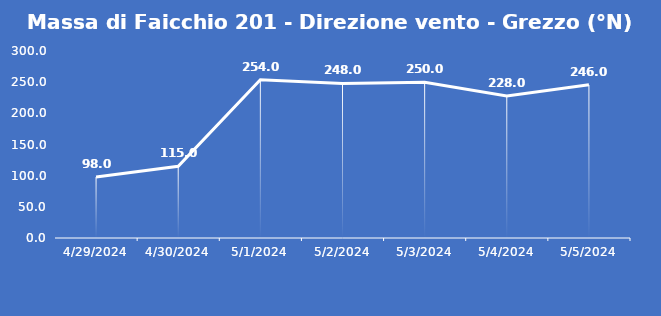
| Category | Massa di Faicchio 201 - Direzione vento - Grezzo (°N) |
|---|---|
| 4/29/24 | 98 |
| 4/30/24 | 115 |
| 5/1/24 | 254 |
| 5/2/24 | 248 |
| 5/3/24 | 250 |
| 5/4/24 | 228 |
| 5/5/24 | 246 |